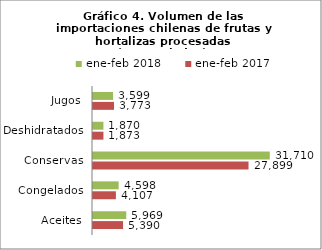
| Category | ene-feb 2017 | ene-feb 2018 |
|---|---|---|
| Aceites | 5390254.478 | 5968981.024 |
| Congelados | 4107099.176 | 4598074.45 |
| Conservas | 27898620.042 | 31710176.61 |
| Deshidratados | 1872888.573 | 1870257.03 |
| Jugos | 3773130.801 | 3598998.404 |